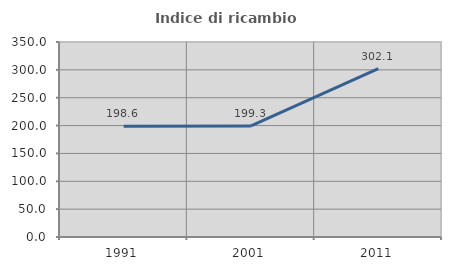
| Category | Indice di ricambio occupazionale  |
|---|---|
| 1991.0 | 198.643 |
| 2001.0 | 199.338 |
| 2011.0 | 302.13 |